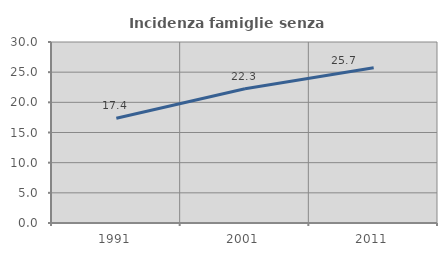
| Category | Incidenza famiglie senza nuclei |
|---|---|
| 1991.0 | 17.352 |
| 2001.0 | 22.264 |
| 2011.0 | 25.721 |